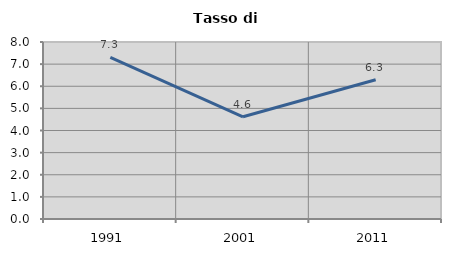
| Category | Tasso di disoccupazione   |
|---|---|
| 1991.0 | 7.31 |
| 2001.0 | 4.62 |
| 2011.0 | 6.293 |